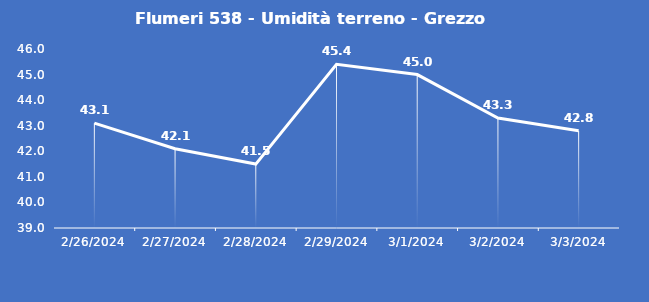
| Category | Flumeri 538 - Umidità terreno - Grezzo (%VWC) |
|---|---|
| 2/26/24 | 43.1 |
| 2/27/24 | 42.1 |
| 2/28/24 | 41.5 |
| 2/29/24 | 45.4 |
| 3/1/24 | 45 |
| 3/2/24 | 43.3 |
| 3/3/24 | 42.8 |